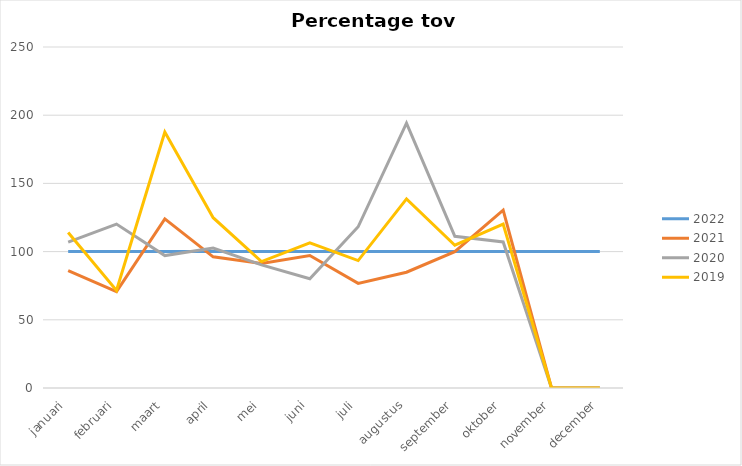
| Category | 2022 | 2021 | 2020 | 2019 |
|---|---|---|---|---|
| januari | 100 | 86.047 | 106.977 | 113.953 |
| februari | 100 | 70.722 | 120.152 | 71.483 |
| maart | 100 | 123.977 | 97.076 | 187.719 |
| april | 100 | 96.178 | 102.548 | 124.841 |
| mei | 100 | 91.262 | 90.291 | 92.718 |
| juni | 100 | 97.163 | 80.142 | 106.383 |
| juli | 100 | 76.716 | 118.209 | 93.433 |
| augustus | 100 | 84.874 | 194.118 | 138.655 |
| september | 100 | 100 | 111.215 | 104.673 |
| oktober | 100 | 130.435 | 107.065 | 120.109 |
| november | 100 | 0 | 0 | 0 |
| december | 100 | 0 | 0 | 0 |